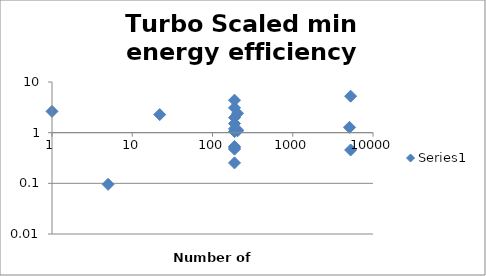
| Category | Series 0 |
|---|---|
| 5263.0 | 5.252 |
| 5075.0 | 0 |
| 5263.0 | 0.455 |
| 205.0 | 1.089 |
| 188.0 | 1.049 |
| 188.0 | 1.98 |
| 188.0 | 0 |
| 205.0 | 2.409 |
| 188.0 | 0.474 |
| 5092.0 | 1.276 |
| 205.0 | 1.127 |
| 188.0 | 3.093 |
| 188.0 | 4.371 |
| 22.0 | 2.277 |
| 188.0 | 0 |
| 188.0 | 1.515 |
| 188.0 | 0.535 |
| 188.0 | 0.5 |
| 188.0 | 1.188 |
| 188.0 | 0.253 |
| 5.0 | 0.096 |
| 1.0 | 2.628 |